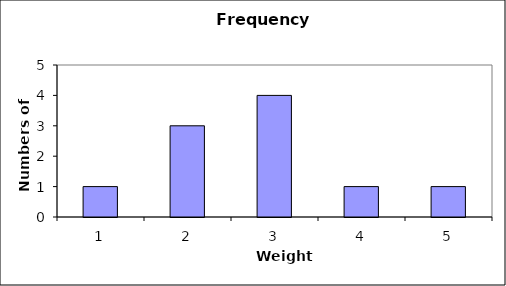
| Category | Series 0 |
|---|---|
| 0 | 1 |
| 1 | 3 |
| 2 | 4 |
| 3 | 1 |
| 4 | 1 |